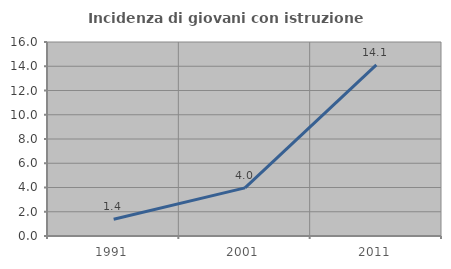
| Category | Incidenza di giovani con istruzione universitaria |
|---|---|
| 1991.0 | 1.382 |
| 2001.0 | 3.971 |
| 2011.0 | 14.108 |